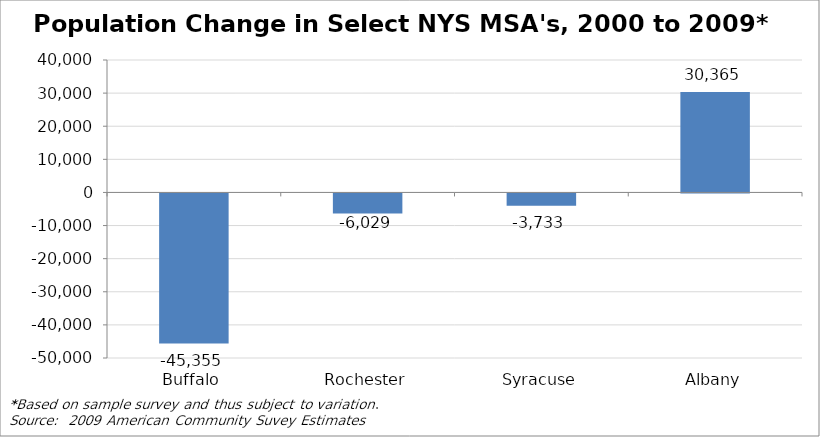
| Category | Series 0 |
|---|---|
| Buffalo | -45355 |
| Rochester | -6029 |
| Syracuse | -3733 |
| Albany | 30365 |